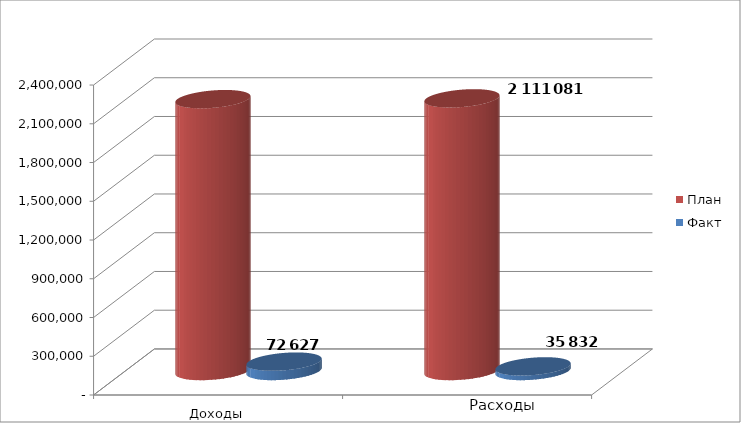
| Category | План | Факт |
|---|---|---|
| 0 | 2104927 | 72627 |
| 1 | 2111081 | 35832 |